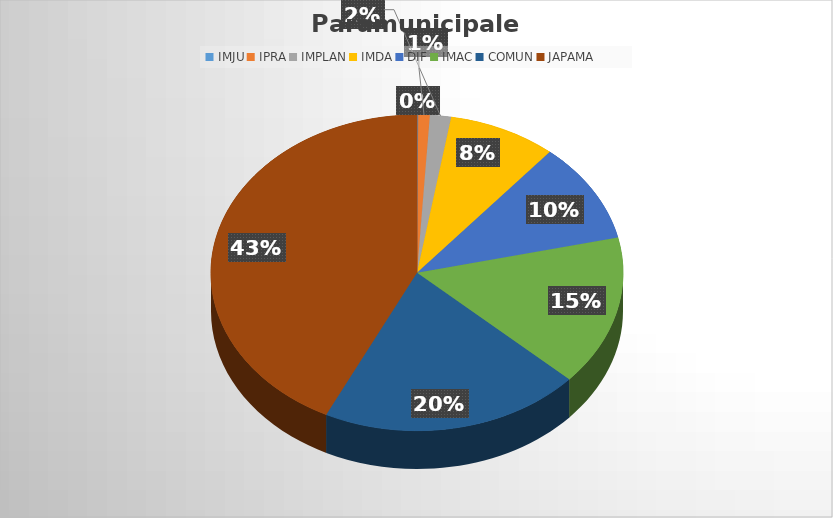
| Category | Suma  |
|---|---|
| IMJU | 20180 |
| IPRA | 190000 |
| IMPLAN | 350000 |
| IMDA | 1793260.6 |
| DIF | 2166667 |
| IMAC | 3249880.98 |
| COMUN | 4324074.65 |
| JAPAMA | 9030667.9 |